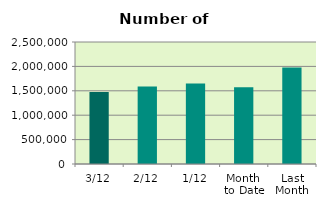
| Category | Series 0 |
|---|---|
| 3/12 | 1476834 |
| 2/12 | 1588060 |
| 1/12 | 1647540 |
| Month 
to Date | 1570811.333 |
| Last
Month | 1976001.238 |